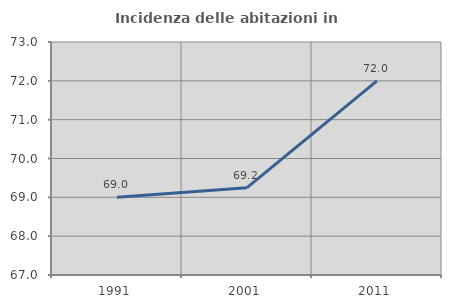
| Category | Incidenza delle abitazioni in proprietà  |
|---|---|
| 1991.0 | 69 |
| 2001.0 | 69.248 |
| 2011.0 | 72 |